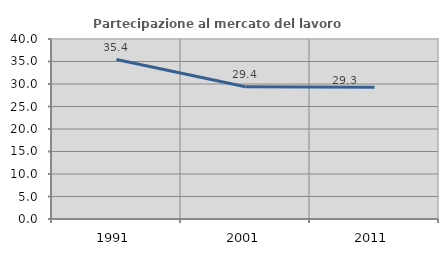
| Category | Partecipazione al mercato del lavoro  femminile |
|---|---|
| 1991.0 | 35.426 |
| 2001.0 | 29.381 |
| 2011.0 | 29.255 |